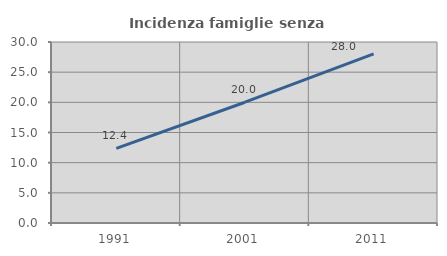
| Category | Incidenza famiglie senza nuclei |
|---|---|
| 1991.0 | 12.367 |
| 2001.0 | 20.019 |
| 2011.0 | 28.046 |